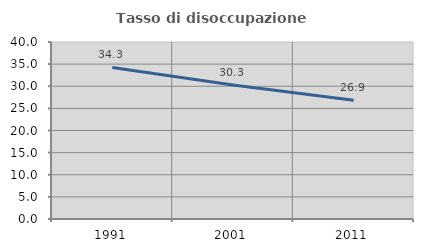
| Category | Tasso di disoccupazione giovanile  |
|---|---|
| 1991.0 | 34.252 |
| 2001.0 | 30.303 |
| 2011.0 | 26.852 |